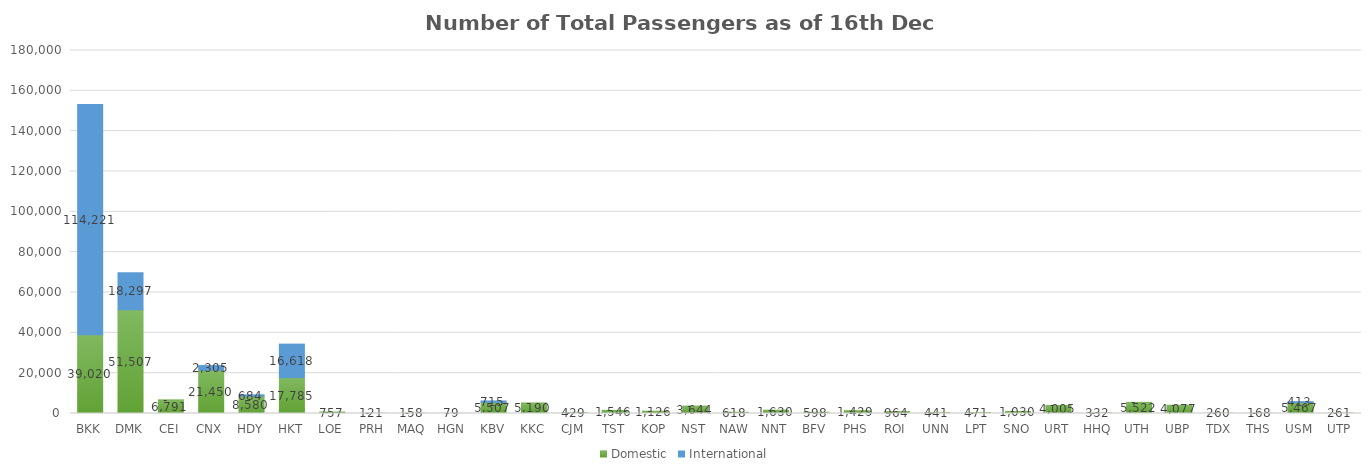
| Category | Domestic | International |
|---|---|---|
| BKK | 39020 | 114221 |
| DMK | 51507 | 18297 |
| CEI | 6791 | 0 |
| CNX | 21450 | 2305 |
| HDY | 8580 | 684 |
| HKT | 17785 | 16618 |
| LOE | 757 | 0 |
| PRH | 121 | 0 |
| MAQ | 158 | 0 |
| HGN | 79 | 0 |
| KBV | 5507 | 715 |
| KKC | 5190 | 0 |
| CJM | 429 | 0 |
| TST | 1546 | 0 |
| KOP | 1126 | 0 |
| NST | 3644 | 0 |
| NAW | 618 | 0 |
| NNT | 1630 | 0 |
| BFV | 598 | 0 |
| PHS | 1429 | 0 |
| ROI | 964 | 0 |
| UNN | 441 | 0 |
| LPT | 471 | 0 |
| SNO | 1030 | 0 |
| URT | 4005 | 0 |
| HHQ | 332 | 0 |
| UTH | 5522 | 0 |
| UBP | 4077 | 0 |
| TDX | 260 | 0 |
| THS | 168 | 0 |
| USM | 5467 | 413 |
| UTP | 261 | 0 |